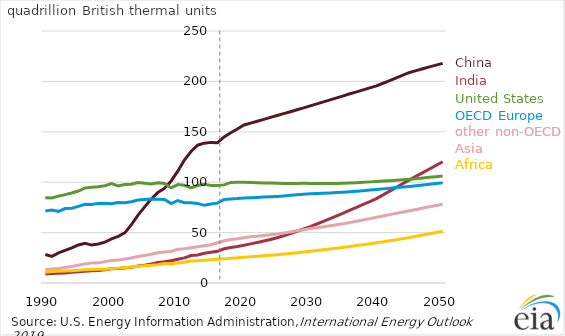
| Category | China | India | Other Asia | Africa | OECD Europe | United States |
|---|---|---|---|---|---|---|
| 1990.0 | 28.27 | 8.864 | 13.217 | 10.78 | 71.363 | 84.592 |
| 1991.0 | 26.363 | 9.314 | 13.844 | 11.421 | 72.505 | 84.377 |
| 1992.0 | 29.939 | 9.578 | 14.31 | 11.728 | 71.089 | 86.163 |
| 1993.0 | 32.316 | 9.939 | 15.337 | 11.87 | 73.882 | 87.652 |
| 1994.0 | 34.815 | 10.598 | 16.484 | 12.197 | 74.093 | 89.286 |
| 1995.0 | 37.734 | 11.205 | 17.671 | 12.726 | 75.978 | 91.247 |
| 1996.0 | 39.482 | 11.678 | 18.987 | 13.143 | 78.133 | 94.328 |
| 1997.0 | 37.618 | 12.183 | 19.782 | 13.464 | 77.96 | 95.014 |
| 1998.0 | 38.693 | 12.391 | 19.848 | 13.648 | 78.982 | 95.578 |
| 1999.0 | 40.548 | 13.164 | 21.214 | 13.744 | 79.13 | 96.506 |
| 2000.0 | 43.736 | 14.031 | 22.443 | 14.2 | 78.646 | 98.661 |
| 2001.0 | 46.31 | 14.328 | 22.772 | 14.756 | 79.85 | 96.211 |
| 2002.0 | 49.708 | 14.954 | 23.746 | 15.201 | 79.612 | 97.741 |
| 2003.0 | 57.906 | 15.516 | 24.825 | 15.786 | 80.689 | 97.936 |
| 2004.0 | 67.361 | 16.768 | 26.236 | 16.562 | 82.307 | 99.73 |
| 2005.0 | 75.472 | 17.64 | 27.316 | 17.232 | 82.855 | 98.856 |
| 2006.0 | 83.398 | 18.893 | 28.519 | 17.56 | 83.406 | 98.149 |
| 2007.0 | 89.826 | 20.366 | 29.906 | 18.216 | 83.012 | 99.449 |
| 2008.0 | 93.925 | 20.99 | 30.74 | 19.3 | 82.822 | 98.705 |
| 2009.0 | 101.234 | 22.043 | 31.331 | 18.957 | 78.842 | 94.362 |
| 2010.0 | 110.95 | 23.571 | 33.58 | 19.824 | 81.861 | 97.613 |
| 2011.0 | 121.989 | 24.95 | 34.009 | 20.529 | 79.697 | 96.881 |
| 2012.0 | 130.492 | 27.29 | 35.003 | 21.767 | 79.608 | 94.384 |
| 2013.0 | 136.712 | 27.801 | 35.863 | 22.008 | 78.95 | 96.731 |
| 2014.0 | 138.737 | 29.532 | 37.039 | 22.63 | 77.066 | 97.96 |
| 2015.0 | 139.502 | 30.538 | 37.984 | 22.966 | 78.358 | 96.811 |
| 2016.0 | 139.171 | 31.458 | 39.896 | 23.672 | 79.204 | 96.615 |
| 2017.0 | 144.976 | 33.932 | 41.858 | 23.935 | 82.928 | 97.35 |
| 2018.0 | 149.051 | 35.176 | 43.13 | 24.548 | 83.324 | 99.809 |
| 2019.0 | 152.743 | 36.163 | 43.927 | 24.937 | 83.721 | 99.868 |
| 2020.0 | 156.747 | 37.362 | 44.978 | 25.541 | 84.285 | 99.832 |
| 2021.0 | 158.574 | 38.803 | 45.772 | 26.013 | 84.673 | 99.744 |
| 2022.0 | 160.412 | 40.214 | 46.431 | 26.485 | 84.941 | 99.562 |
| 2023.0 | 162.304 | 41.676 | 47.067 | 26.963 | 85.196 | 99.313 |
| 2024.0 | 164.286 | 43.217 | 47.774 | 27.485 | 85.518 | 99.212 |
| 2025.0 | 166.177 | 44.856 | 48.586 | 28.063 | 85.924 | 98.966 |
| 2026.0 | 167.995 | 46.909 | 49.61 | 28.662 | 86.426 | 98.807 |
| 2027.0 | 169.874 | 49.098 | 50.682 | 29.325 | 86.991 | 98.717 |
| 2028.0 | 171.812 | 51.319 | 51.791 | 30.004 | 87.488 | 98.83 |
| 2029.0 | 173.713 | 53.581 | 52.924 | 30.701 | 88.034 | 98.867 |
| 2030.0 | 175.722 | 55.882 | 53.996 | 31.416 | 88.556 | 98.788 |
| 2031.0 | 177.712 | 58.525 | 54.912 | 32.17 | 88.847 | 98.805 |
| 2032.0 | 179.665 | 61.182 | 55.801 | 32.918 | 89.076 | 98.669 |
| 2033.0 | 181.621 | 63.881 | 56.778 | 33.704 | 89.36 | 98.639 |
| 2034.0 | 183.636 | 66.573 | 57.689 | 34.483 | 89.696 | 98.692 |
| 2035.0 | 185.703 | 69.332 | 58.674 | 35.343 | 90.136 | 98.861 |
| 2036.0 | 187.755 | 72.2 | 59.953 | 36.241 | 90.639 | 99.158 |
| 2037.0 | 189.621 | 75.05 | 61.229 | 37.154 | 91.122 | 99.494 |
| 2038.0 | 191.656 | 77.936 | 62.559 | 38.036 | 91.57 | 99.944 |
| 2039.0 | 193.597 | 80.781 | 63.893 | 38.937 | 92.147 | 100.324 |
| 2040.0 | 195.54 | 83.718 | 65.262 | 39.883 | 92.759 | 100.71 |
| 2041.0 | 198.151 | 87.438 | 66.555 | 40.925 | 93.382 | 101.098 |
| 2042.0 | 200.746 | 91.185 | 67.824 | 41.972 | 94.036 | 101.462 |
| 2043.0 | 203.52 | 94.892 | 69.081 | 42.976 | 94.628 | 101.865 |
| 2044.0 | 206.216 | 98.647 | 70.357 | 44.007 | 95.198 | 102.375 |
| 2045.0 | 208.868 | 102.339 | 71.624 | 45.083 | 95.804 | 102.964 |
| 2046.0 | 210.716 | 105.977 | 72.956 | 46.329 | 96.499 | 103.536 |
| 2047.0 | 212.565 | 109.493 | 74.319 | 47.599 | 97.192 | 104.183 |
| 2048.0 | 214.406 | 113.113 | 75.548 | 48.919 | 97.925 | 104.859 |
| 2049.0 | 216.105 | 116.711 | 76.816 | 50.136 | 98.601 | 105.415 |
| 2050.0 | 217.872 | 120.258 | 78.22 | 51.416 | 99.339 | 106.046 |